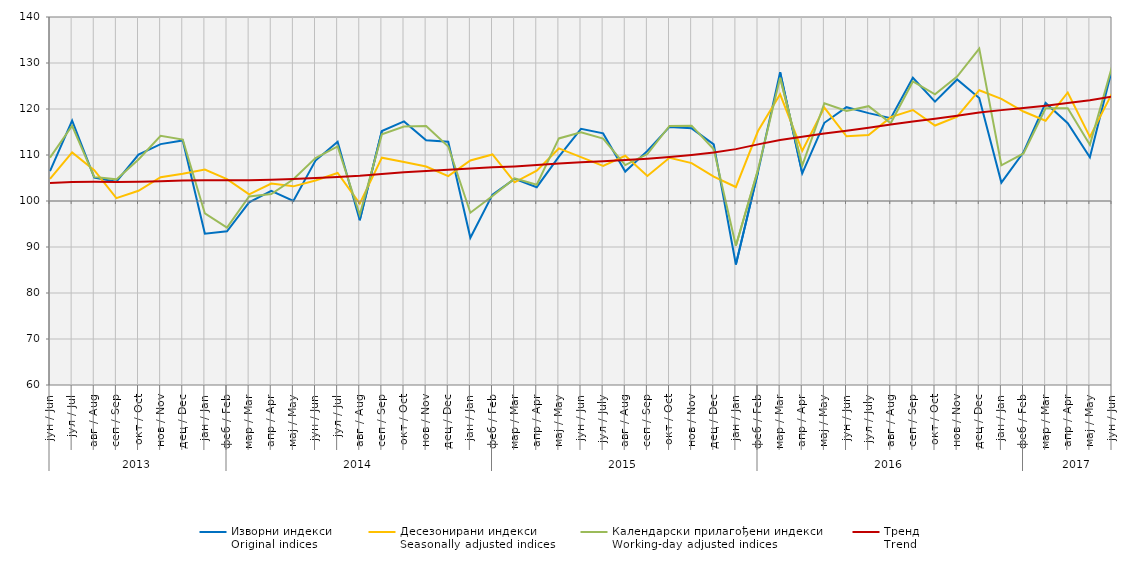
| Category | Изворни индекси
Original indices | Десезонирани индекси
Seasonally adjusted indices | Календарски прилагођени индекси
Working-day adjusted indices | Тренд
Trend |
|---|---|---|---|---|
| 0 | 106.478 | 104.79 | 109.431 | 103.9 |
| 1 | 117.488 | 110.562 | 116.359 | 104.133 |
| 2 | 105.073 | 106.692 | 105.243 | 104.164 |
| 3 | 104.198 | 100.63 | 104.703 | 104.114 |
| 4 | 110.096 | 102.212 | 109.038 | 104.175 |
| 5 | 112.368 | 105.159 | 114.192 | 104.315 |
| 6 | 113.169 | 105.924 | 113.352 | 104.437 |
| 7 | 92.9 | 106.842 | 97.299 | 104.505 |
| 8 | 93.4 | 104.739 | 94.213 | 104.502 |
| 9 | 99.7 | 101.461 | 100.975 | 104.506 |
| 10 | 102.2 | 103.777 | 101.5 | 104.607 |
| 11 | 100 | 103.186 | 104.734 | 104.763 |
| 12 | 108.8 | 104.442 | 109.332 | 104.983 |
| 13 | 112.9 | 106.101 | 111.86 | 105.21 |
| 14 | 95.8 | 99.432 | 97.021 | 105.477 |
| 15 | 115.2 | 109.424 | 114.481 | 105.888 |
| 16 | 117.3 | 108.478 | 116.202 | 106.257 |
| 17 | 113.2 | 107.506 | 116.308 | 106.52 |
| 18 | 112.9 | 105.403 | 111.856 | 106.781 |
| 19 | 92 | 108.817 | 97.458 | 107.079 |
| 20 | 101.4 | 110.109 | 101.087 | 107.327 |
| 21 | 104.8 | 104.072 | 104.923 | 107.515 |
| 22 | 103 | 106.587 | 103.541 | 107.809 |
| 23 | 109.651 | 111.428 | 113.603 | 108.159 |
| 24 | 115.698 | 109.541 | 114.955 | 108.419 |
| 25 | 114.7 | 107.647 | 113.578 | 108.656 |
| 26 | 106.4 | 109.828 | 107.806 | 108.912 |
| 27 | 110.9 | 105.434 | 110.213 | 109.195 |
| 28 | 116.1 | 109.405 | 116.321 | 109.58 |
| 29 | 115.8 | 108.233 | 116.375 | 110.023 |
| 30 | 112.3 | 105.287 | 111.227 | 110.533 |
| 31 | 86.2 | 103.038 | 90.271 | 111.275 |
| 32 | 106.3 | 115.205 | 106.802 | 112.306 |
| 33 | 128 | 123.189 | 126.781 | 113.246 |
| 34 | 106 | 110.909 | 107.709 | 113.955 |
| 35 | 117 | 120.31 | 121.242 | 114.662 |
| 36 | 120.4 | 114.057 | 119.591 | 115.29 |
| 37 | 119.1 | 114.337 | 120.62 | 115.916 |
| 38 | 118 | 118.239 | 116.895 | 116.628 |
| 39 | 126.8 | 119.778 | 125.988 | 117.29 |
| 40 | 121.6 | 116.404 | 123.18 | 117.895 |
| 41 | 126.424 | 118.328 | 127.036 | 118.554 |
| 42 | 122.4 | 124.081 | 133.131 | 119.219 |
| 43 | 104 | 122.202 | 107.766 | 119.755 |
| 44 | 110.6 | 119.448 | 110.335 | 120.196 |
| 45 | 121.316 | 117.458 | 120.15 | 120.709 |
| 46 | 116.9 | 123.587 | 120.166 | 121.285 |
| 47 | 109.5 | 113.935 | 112.219 | 121.902 |
| 48 | 128.6 | 123.396 | 129.233 | 122.724 |